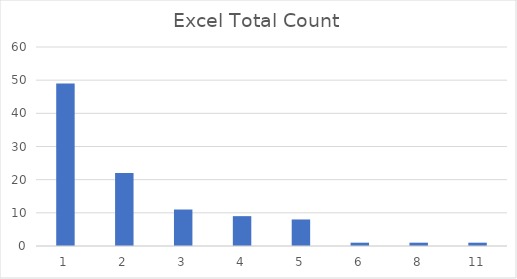
| Category | Total Count |
|---|---|
| 1.0 | 49 |
| 2.0 | 22 |
| 3.0 | 11 |
| 4.0 | 9 |
| 5.0 | 8 |
| 6.0 | 1 |
| 8.0 | 1 |
| 11.0 | 1 |